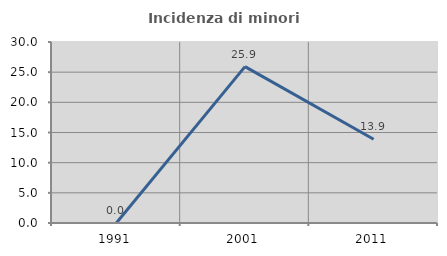
| Category | Incidenza di minori stranieri |
|---|---|
| 1991.0 | 0 |
| 2001.0 | 25.926 |
| 2011.0 | 13.889 |